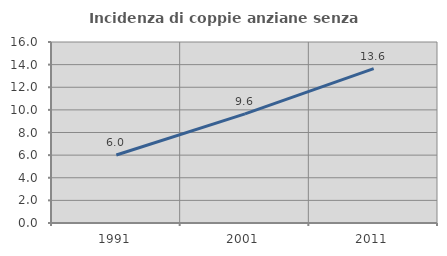
| Category | Incidenza di coppie anziane senza figli  |
|---|---|
| 1991.0 | 6.006 |
| 2001.0 | 9.642 |
| 2011.0 | 13.644 |